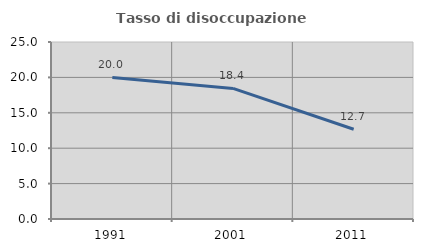
| Category | Tasso di disoccupazione giovanile  |
|---|---|
| 1991.0 | 20 |
| 2001.0 | 18.447 |
| 2011.0 | 12.676 |